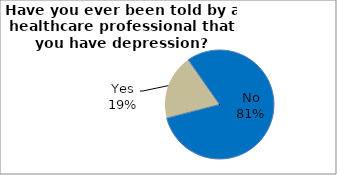
| Category | Series 0 |
|---|---|
| No | 80.697 |
| Yes | 19.303 |